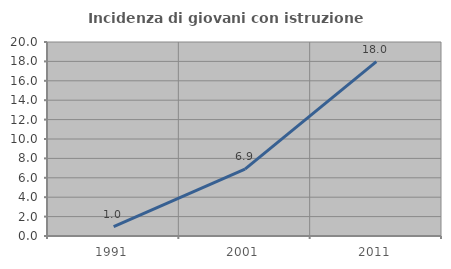
| Category | Incidenza di giovani con istruzione universitaria |
|---|---|
| 1991.0 | 0.962 |
| 2001.0 | 6.897 |
| 2011.0 | 17.978 |